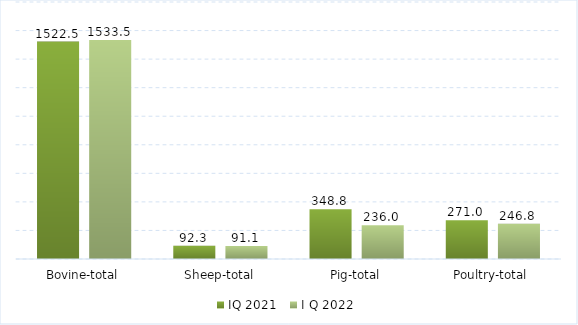
| Category | IQ 2021 | I Q 2022 |
|---|---|---|
| Bovine-total | 1522.5 | 1533.5 |
| Sheep-total | 92.3 | 91.1 |
| Pig-total | 348.8 | 236 |
| Poultry-total | 271 | 246.8 |